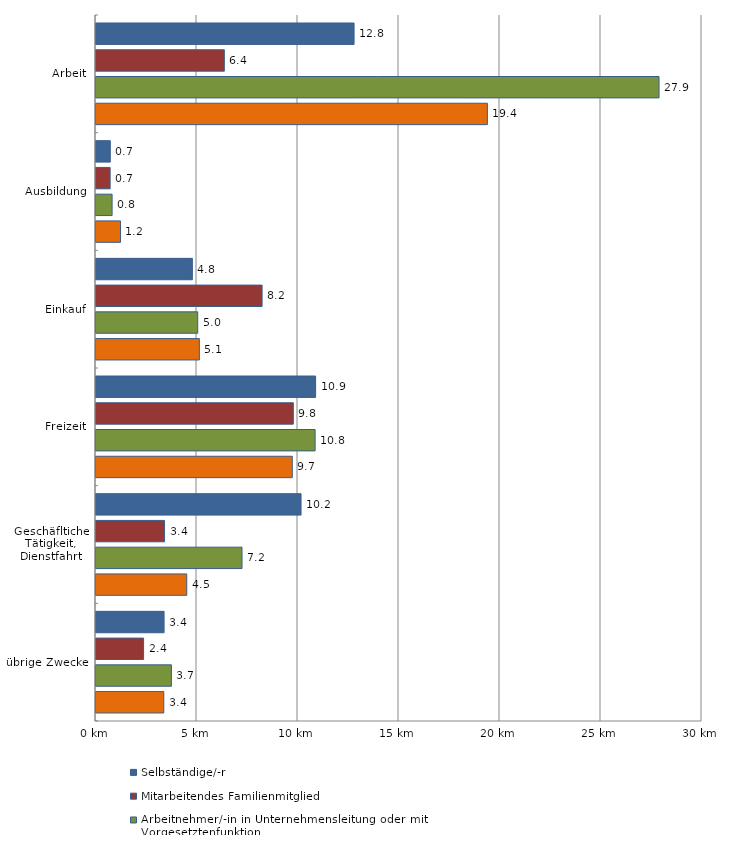
| Category | Selbständige/-r | Mitarbeitendes Familienmitglied | Arbeitnehmer/-in in Unternehmensleitung oder mit Vorgesetztenfunktion | Arbeitnehmer/-in ohne Vorgesetztenfunktion |
|---|---|---|---|---|
| Arbeit | 12.776 | 6.353 | 27.873 | 19.376 |
| Ausbildung | 0.708 | 0.7 | 0.797 | 1.212 |
| Einkauf | 4.771 | 8.222 | 5.036 | 5.117 |
| Freizeit | 10.872 | 9.769 | 10.848 | 9.718 |
| Geschäfltiche Tätigkeit, Dienstfahrt | 10.151 | 3.393 | 7.228 | 4.494 |
| übrige Zwecke | 3.37 | 2.356 | 3.733 | 3.356 |